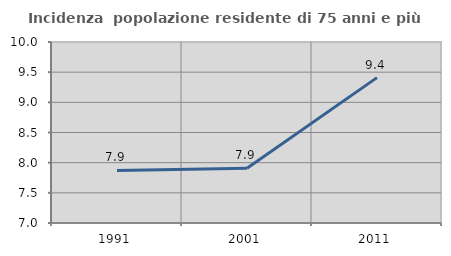
| Category | Incidenza  popolazione residente di 75 anni e più |
|---|---|
| 1991.0 | 7.872 |
| 2001.0 | 7.907 |
| 2011.0 | 9.41 |